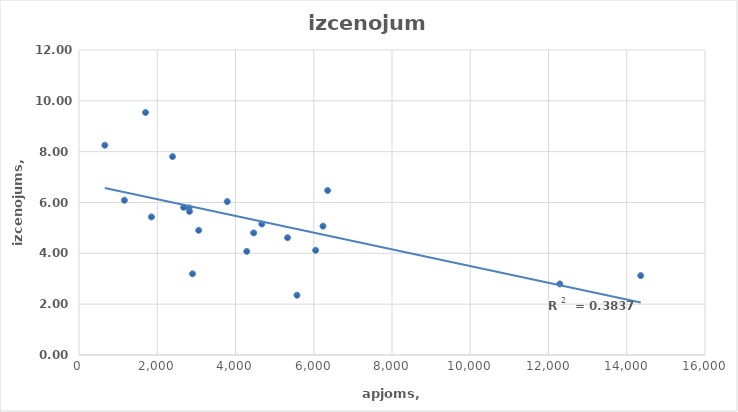
| Category | izcenojums |
|---|---|
| 2901.0 | 3.194 |
| 2812.0 | 5.788 |
| 14357.0 | 3.123 |
| 4464.0 | 4.803 |
| 1852.0 | 5.433 |
| 6355.0 | 6.474 |
| 2824.0 | 5.65 |
| 1700.0 | 9.544 |
| 660.0 | 8.253 |
| 12289.0 | 2.797 |
| 5330.0 | 4.615 |
| 6048.0 | 4.12 |
| 3788.0023 | 6.036 |
| 2391.0 | 7.807 |
| 6235.5484 | 5.069 |
| 4288.0 | 4.077 |
| 1160.0 | 6.089 |
| 5571.563 | 2.352 |
| 3059.0 | 4.907 |
| 2673.0 | 5.81 |
| 4672.021000000001 | 5.154 |